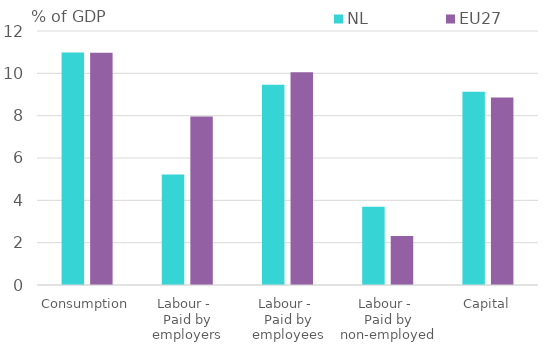
| Category | NL | EU27 |
|---|---|---|
| Consumption | 10.981 | 10.967 |
| Labour - 
Paid by employers | 5.217 | 7.966 |
| Labour - 
Paid by employees | 9.456 | 10.052 |
| Labour - 
Paid by non-employed | 3.696 | 2.311 |
| Capital | 9.136 | 8.858 |